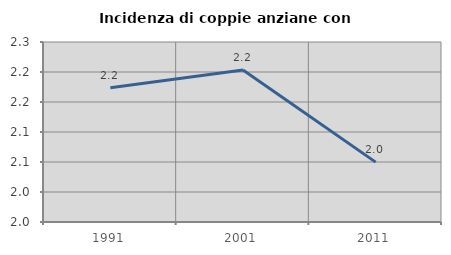
| Category | Incidenza di coppie anziane con figli |
|---|---|
| 1991.0 | 2.174 |
| 2001.0 | 2.203 |
| 2011.0 | 2.05 |